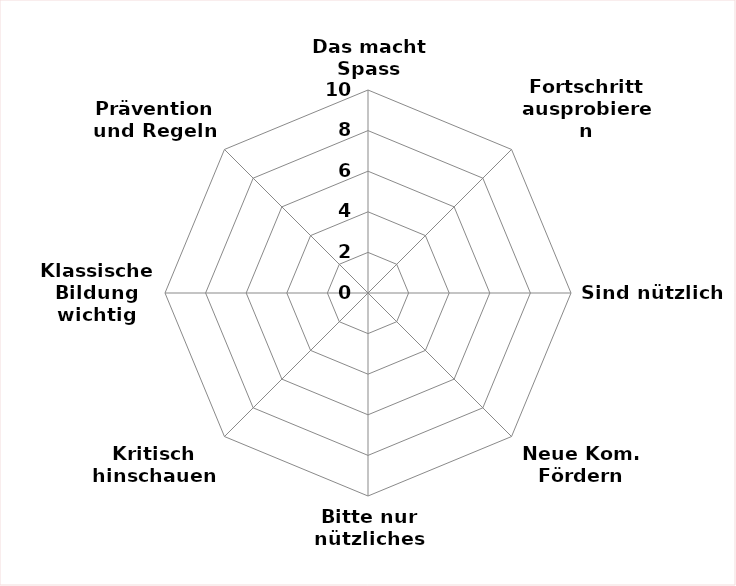
| Category | Series 0 |
|---|---|
| Das macht Spass | 0 |
| Fortschritt ausprobieren | 0 |
| Sind nützlich | 0 |
| Neue Kom. Fördern | 0 |
| Bitte nur nützliches | 0 |
| Kritisch hinschauen | 0 |
| Klassische Bildung wichtig | 0 |
| Prävention und Regeln | 0 |